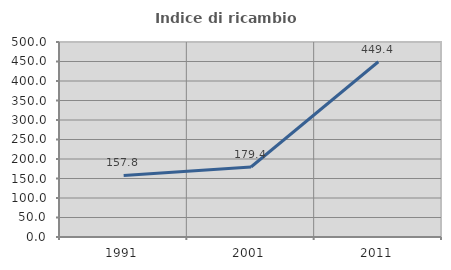
| Category | Indice di ricambio occupazionale  |
|---|---|
| 1991.0 | 157.831 |
| 2001.0 | 179.435 |
| 2011.0 | 449.39 |